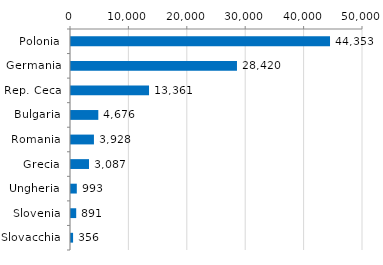
| Category | Series 0 |
|---|---|
| Polonia | 44352.608 |
| Germania | 28420.273 |
| Rep. Ceca | 13361.213 |
| Bulgaria | 4676.137 |
| Romania | 3927.737 |
| Grecia | 3087.486 |
| Ungheria | 993.492 |
| Slovenia | 891.319 |
| Slovacchia | 355.508 |